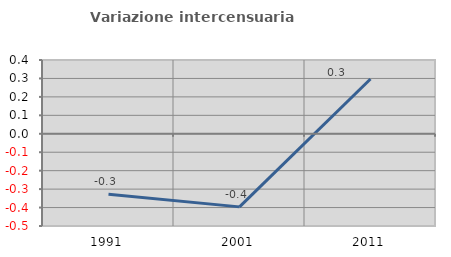
| Category | Variazione intercensuaria annua |
|---|---|
| 1991.0 | -0.328 |
| 2001.0 | -0.396 |
| 2011.0 | 0.297 |